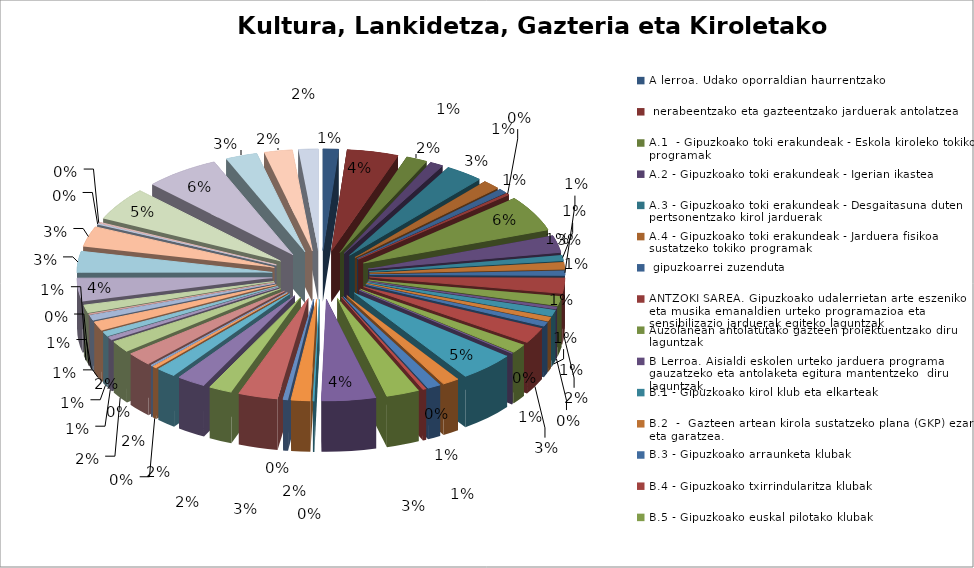
| Category |  Eskaerak |  Ezetsiak | Emakida |
|---|---|---|---|
| A lerroa. Udako oporraldian haurrentzako, nerabeentzako eta gazteentzako jarduerak antolatzea | 22 | 2 | 73803.41 |
| A.1  - Gipuzkoako toki erakundeak - Eskola kiroleko tokiko programak | 73 | 14 | 689999.99 |
| A.2 - Gipuzkoako toki erakundeak - Igerian ikastea | 30 | 1 | 113634 |
| A.3 - Gipuzkoako toki erakundeak - Desgaitasuna duten pertsonentzako kirol jarduerak | 19 | 4 | 25000 |
| A.4 - Gipuzkoako toki erakundeak - Jarduera fisikoa sustatzeko tokiko programak, gipuzkoarrei zuzenduta | 54 | 11 | 90000 |
| ANTZOKI SAREA. Gipuzkoako udalerrietan arte eszeniko eta musika emanaldien urteko programazioa eta sensibilizazio jarduerak egiteko laguntzak | 25 | 3 | 200000 |
| Auzolanean antolatutako gazteen proiektuentzako diru laguntzak | 12 | 7 | 20000 |
| B Lerroa. Aisialdi eskolen urteko jarduera programa gauzatzeko eta antolaketa egitura mantentzeko  diru laguntzak. | 5 | 0 | 78000 |
| B.1 - Gipuzkoako kirol klub eta elkarteak | 97 | 13 | 404780.41 |
| B.2  -  Gazteen artean kirola sustatzeko plana (GKP) ezarri eta garatzea. | 46 | 2 | 206512.77 |
| B.3 - Gipuzkoako arraunketa klubak | 15 | 1 | 248911.16 |
| B.4 - Gipuzkoako txirrindularitza klubak | 19 | 5 | 20000 |
| B.5 - Gipuzkoako euskal pilotako klubak | 13 | 1 | 14999.98 |
| B.6 - Euskal Autonomia Erkidegotik kanpo lehiatzen diren taldeak dituzten klubak. | 42 | 11 | 54731.48 |
| BEKAK: musika, dantza, arte dramatikoa, ikus-arteak, erakusketen komisariaketa, moda eta diseinua eta arkitektura arloetan ikasketak egiteko | 25 | 11 | 117450 |
| C Lerroa. Haur eta gazteen alorrean jarduten duten udalerriz gaindiko elkarte erakundeen antolaketa egitura mantentzeko diru laguntzak. | 6 | 0 | 10000 |
| C.1 - Prestakuntza programa ez-arautuak, Jarduera fisikoaren eta Kirolaren arloan. | 17 | 11 | 5568.78 |
| C.2.a) - Errendimenduko kirol materiala | 11 | 7 | 25396.12 |
| C.2.b) - Eskola kiroleko kirol materiala kirol federazioentzat | 12 | 4 | 19283.02 |
| C.3 - Eskola umeek igerian ikasteko sustapen jarduerak | 43 | 6 | 41454 |
| C.4  - Desgaitasuna duten pertsonentzako kirol jarduerak. | 24 | 4 | 43000 |
| C.5.a) -  Mugikortasuneko udal planak. | 1 | 0 | 2536.63 |
| C.5.b) Parte hartzeko lehiaketa jardueretarako joan-etorriak | 80 | 32 | 25459.86 |
| C.5.c) Infantil, kadete eta gazte mailetako taldekako modalitateetako lehiaketa jardueretarako joan-etorriak | 24 | 4 | 56003.5 |
| C.6 - Aparteko kirol ekitaldiak antolatzea. | 19 | 13 | 14671.76 |
| C.7 - Mugaz gaindiko kirol proiektuak | 5 | 4 | 988.07 |
| COVID-19: Kultura zerbitzuen sektoreko autonomoei zuzendutako dirulaguntzak | 47 | 8 | 72072.02 |
| D Lerroa. Udalek haur, nerabe eta gazteentzako planak eta proiektuak garatzeko diru laguntzak. | 77 | 7 | 449999.92 |
| EQZEko (Elias Querejeta Zine Eskola) graduondoko ikastaroetakoaren batean matrikulazio gastuak ordaintzeko beka | 2 | 1 | 2500 |
| Etorkizuneko kirolariak | 27 | 27 | 0 |
| Gipuzkoako agiri ondarea zaharberritzekodiru laguntzak (2020) | 7 | 1 | 15456.29 |
| Gipuzkoako kultur ondarea zaharberritzeko eta sendotzeko diru laguntzak (2020) | 56 | 30 | 410760 |
| Gipuzkoako lurralde Historikoan arkeologi ondasunei eragiten dien obren ondoriozko arkeologia-jarduerak gauzatzeko diru laguntzak | 33 | 15 | 53615.35 |
| Gipuzkoako lurraldean arkeologi ikerketak egiteko eta zabaltzeko diru-laguntzak. 2020 | 41 | 7 | 197912 |
| Gipuzkoako MUSEO guneei zuzendutako diru laguntzak (2020) | 28 | 1 | 264220 |
| Gordailua. Gipuzkoako Kultura ondare higigarriaren zentroan etnografiaren alorrean prestakun­tza praktika egiteko beka | 6 | 5 | 10000 |
| Gordailuko zaharberritze lantegian  zaharberritze eta kontserbazio praktikak egiteko bekak. | 3 | 2 | 10000 |
| I. eranskina - Tokiko garapen proiektuak, hegoaldeko herrialde  eta herri pobretuetan | 37 | 23 | 1679733.05 |
| II. eranskina - Gizartea eraldatzeko hezkuntza proiektuak | 32 | 23 | 533902.11 |
| III A  eranskina - Ekimen puntualak | 9 | 4 | 99823.89 |
| III B  eranskina - Ekimen puntualak | 13 | 1 | 229666.81 |
| IKUSENTZUNEZKOAK: Gipuzkoan gauzatzen diren ikus-entzunezko proiektuak ekoiztu eta hedatzeko diru laguntzak | 25 | 3 | 147792.74 |
| IV. eranskina - Larrialdiko laguntzarako eta ekintza humanitarioko proiektuak | 14 | 5 | 358400.97 |
| José Ignacio Tellechea Idígoras. Historia ikertzeko beka (2020) | 2 | 1 | 10000 |
| KONPAINIA ESZENIKOAK: Eszena ikuskizunak sustatu eta saltzeko, eta sentsibilizazio, prestakuntza eta bitartekotza programetarako diru laguntzak | 22 | 2 | 179996 |
| KULTURA BONUA | 63 | 4 | 99640 |
| KULTURA BONUA ( BIGARREN DEIALDIA) | 58 | 0 | 80000 |
| Kultura Eskola Bonuak (Covid - 19) | 55 | 49 | 490 |
| MUNDURA beren proiektu artistikoak nazioartera eramateko Gipuzkoako pertsona fisiko eta irabazi asmorik gabeko entitateei zuzendutako diru lagun¬tzak | 3 | 2 | 1400 |
| NICANOR ZABALETA beka, harizko tresnen instrumentistentzat | 3 | 2 | 11690 |
| OLATUAK  diru laguntzak: ikuspegi artistiko-kulturaletik prozesu berritzaileekin eta gizarte eraldaketarekin zerikusia duten proiektu puntualetarako | 91 | 55 | 200834 |
| OREKA diru laguntzak: egitasmo egonkorrak dituzten irabazi asmorik gabeko  kultur elkarteentzako, jarduerak eta proiektuak burutzeko | 106 | 50 | 583307.2 |
| SUSPERKA diru laguntzak: Gipuzkoako panorama artistiko-kulturalean egitasmo berriak abiaraziko dituzten elkarteei zuzenduak | 45 | 31 | 132346.09 |
| TOKIKO diru laguntzak: Gipuzkoako Udal, Udal elkarte edo Udal entitateei zuzendutakoak | 40 | 7 | 284813 |
| V. eranskina - Tokiko garapen proiektuak: Afrika | 28 | 21 | 805420.12 |